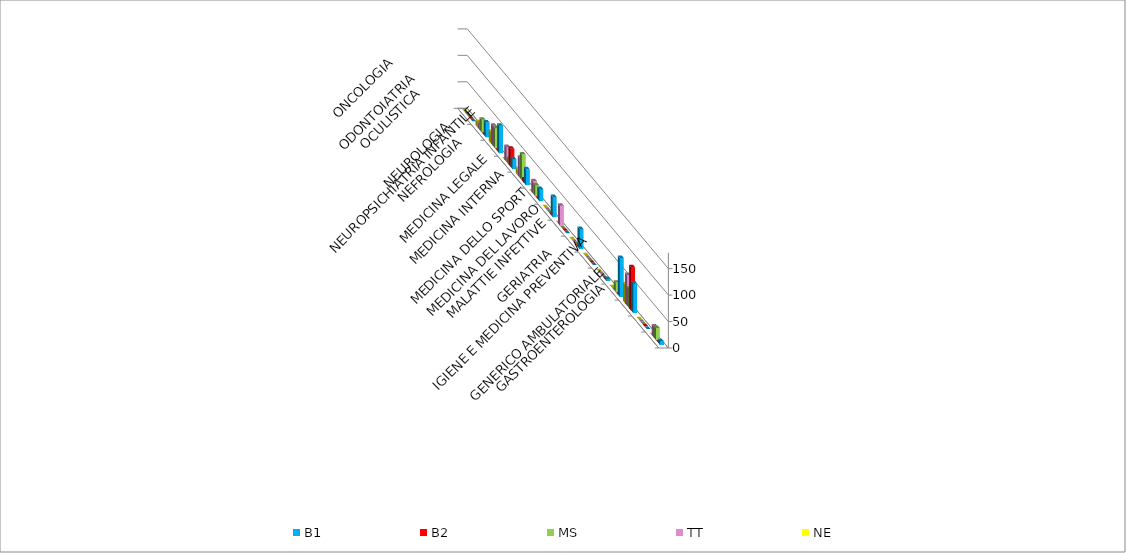
| Category | B1 | B2 | MS | TT | NE |
|---|---|---|---|---|---|
| GASTROENTEROLOGIA | 7 | 0 | 23 | 21 | 0 |
| GENERICO AMBULATORIALE | 0 | 0 | 0 | 0 | 0 |
| GERIATRIA | 56 | 82 | 37 | 58 | 36 |
| IGIENE E MEDICINA PREVENTIVA | 74 | 0 | 18 | 0 | 0 |
| MALATTIE INFETTIVE | 4 | 0 | 0 | 0 | 0 |
| MEDICINA DEL LAVORO | 0 | 0 | 0 | 0 | 0 |
| MEDICINA DELLO SPORT | 38 | 0 | 0 | 0 | 0 |
| MEDICINA INTERNA | 0 | 0 | 0 | 38 | 0 |
| MEDICINA LEGALE | 38 | 0 | 0 | 0 | 0 |
| NEFROLOGIA | 23 | 0 | 21 | 24 | 0 |
| NEUROLOGIA | 30 | 6 | 49 | 38 | 11 |
| NEUROPSICHIATRIA INFANTILE | 19 | 34 | 10 | 28 | 0 |
| OCULISTICA | 52 | 0 | 38 | 38 | 22 |
| ODONTOIATRIA | 28 | 0 | 24 | 11 | 10 |
| ONCOLOGIA | 0 | 0 | 0 | 0 | 0 |